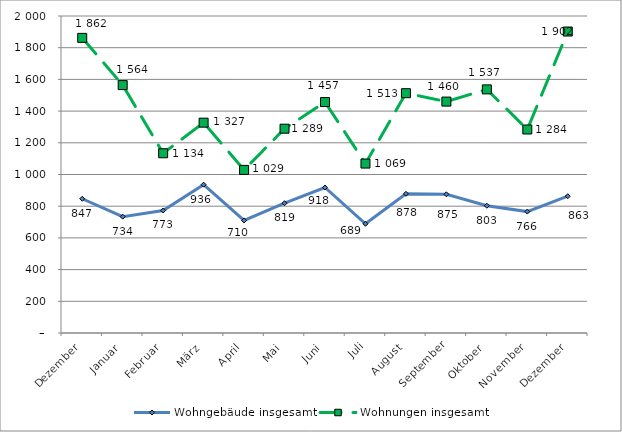
| Category | Wohngebäude insgesamt | Wohnungen insgesamt |
|---|---|---|
| Dezember | 847 | 1862 |
| Januar | 734 | 1564 |
| Februar | 773 | 1134 |
| März | 936 | 1327 |
| April | 710 | 1029 |
| Mai | 819 | 1289 |
| Juni | 918 | 1457 |
| Juli | 689 | 1069 |
| August | 878 | 1513 |
| September | 875 | 1460 |
| Oktober | 803 | 1537 |
| November | 766 | 1284 |
| Dezember | 863 | 1902 |